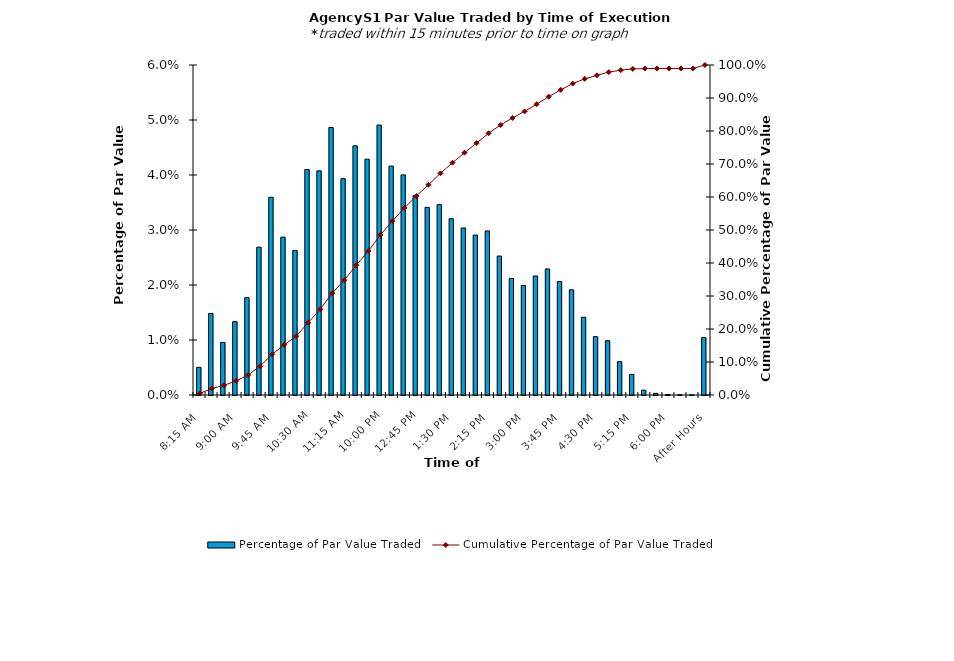
| Category | Percentage of Par Value Traded |
|---|---|
| 8:15 AM | 0.005 |
| 8:30 AM | 0.015 |
| 8:45 AM | 0.01 |
| 9:00 AM | 0.013 |
| 9:15 AM | 0.018 |
| 9:30 AM | 0.027 |
| 9:45 AM | 0.036 |
| 10:00 AM | 0.029 |
| 10:15 AM | 0.026 |
| 10:30 AM | 0.041 |
| 10:45 AM | 0.041 |
| 11:00 AM | 0.049 |
| 11:15 AM | 0.039 |
| 11:30 AM | 0.045 |
| 11:45 AM | 0.043 |
| 12:00 PM | 0.049 |
| 12:15 PM | 0.042 |
| 12:30 PM | 0.04 |
| 12:45 PM | 0.036 |
| 1:00 PM | 0.034 |
| 1:15 PM | 0.035 |
| 1:30 PM | 0.032 |
| 1:45 PM | 0.03 |
| 2:00 PM | 0.029 |
| 2:15 PM | 0.03 |
| 2:30 PM | 0.025 |
| 2:45 PM | 0.021 |
| 3:00 PM | 0.02 |
| 3:15 PM | 0.022 |
| 3:30 PM | 0.023 |
| 3:45 PM | 0.021 |
| 4:00 PM | 0.019 |
| 4:15 PM | 0.014 |
| 4:30 PM | 0.011 |
| 4:45 PM | 0.01 |
| 5:00 PM | 0.006 |
| 5:15 PM | 0.004 |
| 5:30 PM | 0.001 |
| 5:45 PM | 0 |
| 6:00 PM | 0 |
| 6:15 PM | 0 |
| 6:30 PM | 0 |
| After Hours | 0.01 |